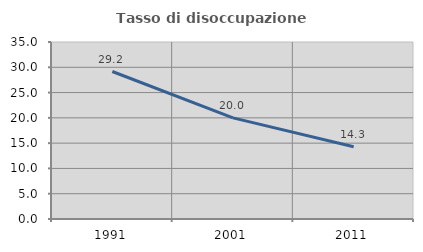
| Category | Tasso di disoccupazione giovanile  |
|---|---|
| 1991.0 | 29.167 |
| 2001.0 | 20 |
| 2011.0 | 14.286 |